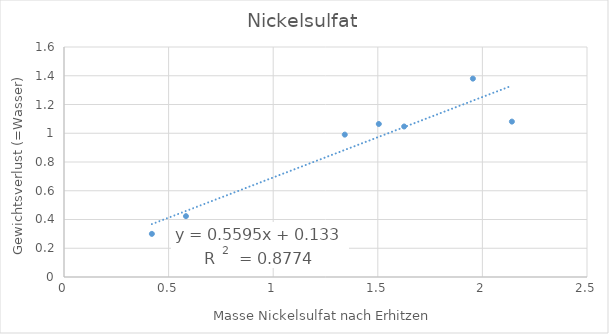
| Category | Series 0 |
|---|---|
| 2.141 | 1.081 |
| 1.5048 | 1.064 |
| 0.583 | 0.423 |
| 1.3421 | 0.99 |
| 0.42 | 0.3 |
| 1.9546 | 1.38 |
| 1.626 | 1.047 |